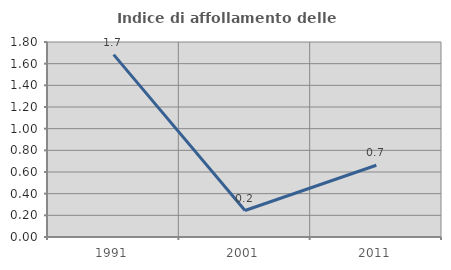
| Category | Indice di affollamento delle abitazioni  |
|---|---|
| 1991.0 | 1.684 |
| 2001.0 | 0.244 |
| 2011.0 | 0.662 |